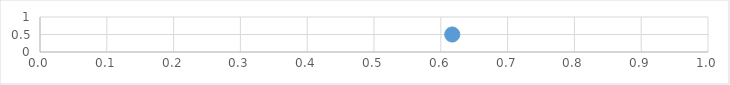
| Category | Series 0 |
|---|---|
| 0.6171399280035493 | 0.5 |